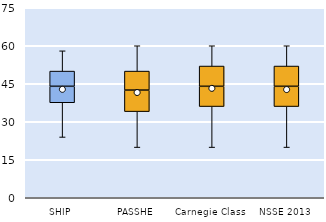
| Category | 25th | 50th | 75th |
|---|---|---|---|
| SHIP | 37.5 | 6.5 | 6 |
| PASSHE | 34 | 8.5 | 7.5 |
| Carnegie Class | 36 | 8 | 8 |
| NSSE 2013 | 36 | 8 | 8 |